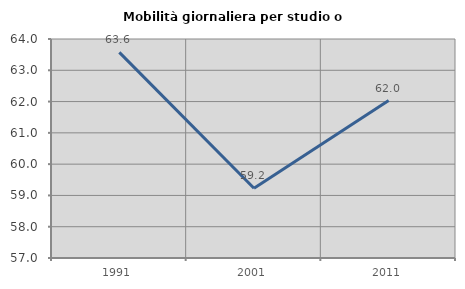
| Category | Mobilità giornaliera per studio o lavoro |
|---|---|
| 1991.0 | 63.574 |
| 2001.0 | 59.229 |
| 2011.0 | 62.031 |